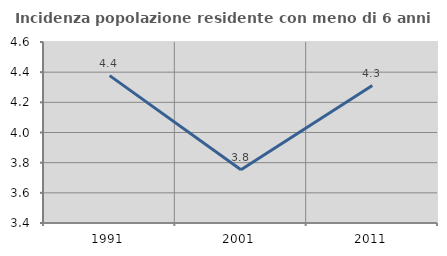
| Category | Incidenza popolazione residente con meno di 6 anni |
|---|---|
| 1991.0 | 4.377 |
| 2001.0 | 3.753 |
| 2011.0 | 4.311 |